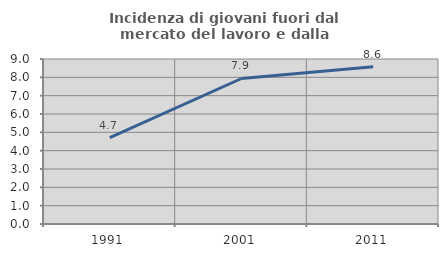
| Category | Incidenza di giovani fuori dal mercato del lavoro e dalla formazione  |
|---|---|
| 1991.0 | 4.706 |
| 2001.0 | 7.937 |
| 2011.0 | 8.571 |